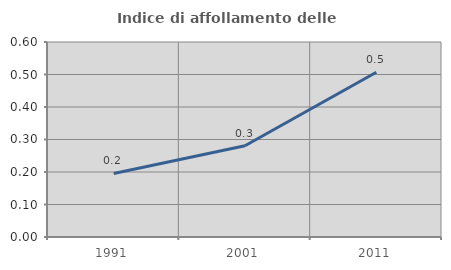
| Category | Indice di affollamento delle abitazioni  |
|---|---|
| 1991.0 | 0.196 |
| 2001.0 | 0.281 |
| 2011.0 | 0.507 |